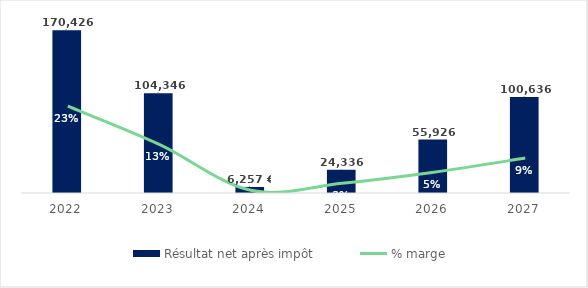
| Category | Résultat net après impôt |
|---|---|
| 2022 | 170426.062 |
| 2023 | 104345.969 |
| 2024 | 6257.281 |
| 2025 | 24335.781 |
| 2026 | 55926 |
| 2027 | 100635.938 |